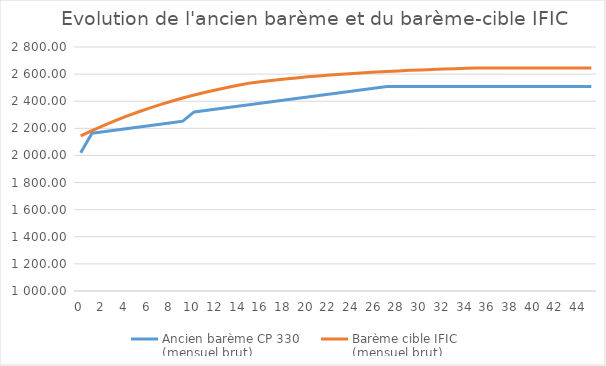
| Category | Ancien barème CP 330 
(mensuel brut) | Barème cible | Barème cible IFIC 
(mensuel brut) |
|---|---|---|---|
| 0.0 | 2020.15 |  | 2144.05 |
| 1.0 | 2164.37 |  | 2183.39 |
| 2.0 | 2175.44 |  | 2220.44 |
| 3.0 | 2186.51 |  | 2255.29 |
| 4.0 | 2197.58 |  | 2288.04 |
| 5.0 | 2208.66 |  | 2318.78 |
| 6.0 | 2219.72 |  | 2347.59 |
| 7.0 | 2230.8 |  | 2374.56 |
| 8.0 | 2241.87 |  | 2399.8 |
| 9.0 | 2252.94 |  | 2423.39 |
| 10.0 | 2321.12 |  | 2445.43 |
| 11.0 | 2332.18 |  | 2466.01 |
| 12.0 | 2343.26 |  | 2485.19 |
| 13.0 | 2354.33 |  | 2503.07 |
| 14.0 | 2365.4 |  | 2519.74 |
| 15.0 | 2376.47 |  | 2535.26 |
| 16.0 | 2387.55 |  | 2545.52 |
| 17.0 | 2398.62 |  | 2555.04 |
| 18.0 | 2409.69 |  | 2563.88 |
| 19.0 | 2420.76 |  | 2572.09 |
| 20.0 | 2431.84 |  | 2579.72 |
| 21.0 | 2442.91 |  | 2586.78 |
| 22.0 | 2453.98 |  | 2593.33 |
| 23.0 | 2465.05 |  | 2599.42 |
| 24.0 | 2476.12 |  | 2605.06 |
| 25.0 | 2487.19 |  | 2610.28 |
| 26.0 | 2498.27 |  | 2615.13 |
| 27.0 | 2509.34 |  | 2619.61 |
| 28.0 | 2509.34 |  | 2623.78 |
| 29.0 | 2509.34 |  | 2627.63 |
| 30.0 | 2509.34 |  | 2631.2 |
| 31.0 | 2509.34 |  | 2634.5 |
| 32.0 | 2509.34 |  | 2637.56 |
| 33.0 | 2509.34 |  | 2640.4 |
| 34.0 | 2509.34 |  | 2643.02 |
| 35.0 | 2509.34 |  | 2645.46 |
| 36.0 | 2509.34 |  | 2645.46 |
| 37.0 | 2509.34 |  | 2645.46 |
| 38.0 | 2509.34 |  | 2645.46 |
| 39.0 | 2509.34 |  | 2645.46 |
| 40.0 | 2509.34 |  | 2645.46 |
| 41.0 | 2509.34 |  | 2645.46 |
| 42.0 | 2509.34 |  | 2645.46 |
| 43.0 | 2509.34 |  | 2645.46 |
| 44.0 | 2509.34 |  | 2645.46 |
| 45.0 | 2509.34 |  | 2645.46 |